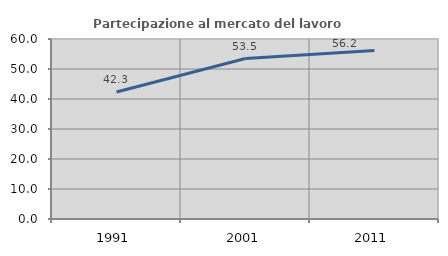
| Category | Partecipazione al mercato del lavoro  femminile |
|---|---|
| 1991.0 | 42.314 |
| 2001.0 | 53.479 |
| 2011.0 | 56.207 |